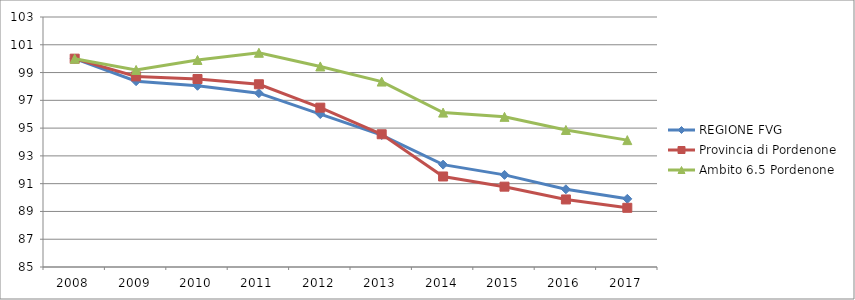
| Category | REGIONE FVG | Provincia di Pordenone | Ambito 6.5 Pordenone |
|---|---|---|---|
| 2008.0 | 100 | 100 | 100 |
| 2009.0 | 98.378 | 98.723 | 99.189 |
| 2010.0 | 98.049 | 98.535 | 99.907 |
| 2011.0 | 97.515 | 98.157 | 100.426 |
| 2012.0 | 96.012 | 96.472 | 99.441 |
| 2013.0 | 94.5 | 94.558 | 98.351 |
| 2014.0 | 92.37 | 91.517 | 96.117 |
| 2015.0 | 91.632 | 90.784 | 95.811 |
| 2016.0 | 90.595 | 89.863 | 94.867 |
| 2017.0 | 89.908 | 89.262 | 94.136 |